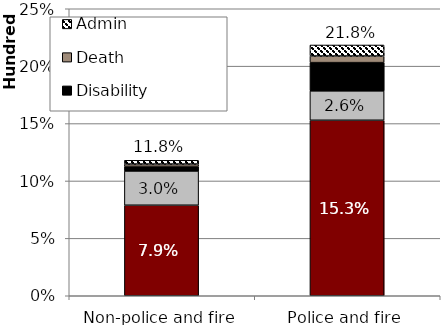
| Category | Retirement | Termination and refund | Disability | Death | Admin |
|---|---|---|---|---|---|
| Non-police and fire | 7.886 | 2.989 | 0.389 | 0.212 | 0.326 |
| Police and fire | 15.286 | 2.562 | 2.459 | 0.581 | 0.956 |